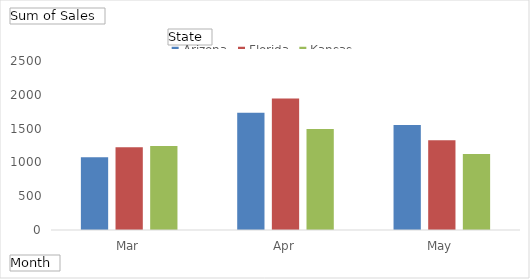
| Category | Arizona | Florida | Kansas |
|---|---|---|---|
| Mar | 1075 | 1225 | 1243 |
| Apr | 1736 | 1946 | 1495 |
| May | 1555 | 1327 | 1125 |